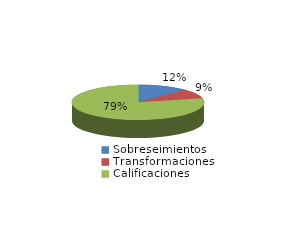
| Category | Series 0 |
|---|---|
| Sobreseimientos | 275 |
| Transformaciones | 200 |
| Calificaciones | 1762 |